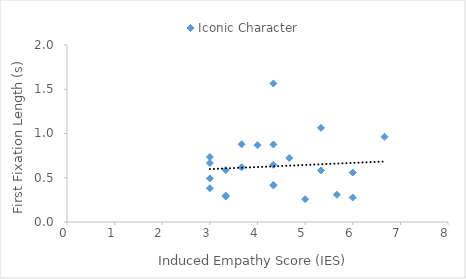
| Category | Iconic Character |
|---|---|
| 4.333333333333333 | 1.565 |
| 3.3333333333333335 | 0.288 |
| 5.333333333333333 | 0.582 |
| 6.0 | 0.277 |
| 4.333333333333333 | 0.418 |
| 6.0 | 0.559 |
| 5.333333333333333 | 1.064 |
| 4.0 | 0.868 |
| 5.666666666666667 | 0.308 |
| 6.666666666666667 | 0.963 |
| 4.333333333333333 | 0.646 |
| 5.0 | 0.258 |
| 3.0 | 0.382 |
| 4.333333333333333 | 0.876 |
| 4.333333333333333 | 0.414 |
| 3.3333333333333335 | 0.299 |
| 3.0 | 0.492 |
| 3.6666666666666665 | 0.878 |
| 3.3333333333333335 | 0.587 |
| 3.0 | 0.666 |
| 3.6666666666666665 | 0.618 |
| 3.0 | 0.735 |
| 4.666666666666667 | 0.723 |